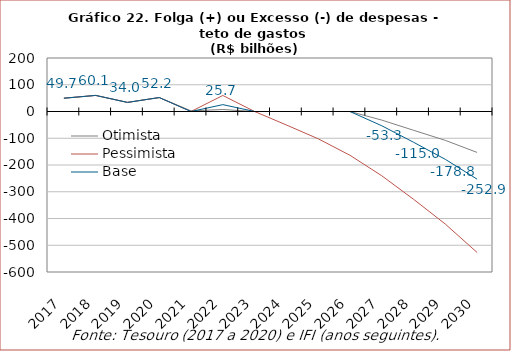
| Category | Otimista | Pessimista | Base |
|---|---|---|---|
| 2017.0 | 49.694 | 49.694 | 49.694 |
| 2018.0 | 60.12 | 60.12 | 60.12 |
| 2019.0 | 34.003 | 34.003 | 34.003 |
| 2020.0 | 52.155 | 52.155 | 52.155 |
| 2021.0 | 2.228 | 0 | 0 |
| 2022.0 | 7.449 | 59.947 | 25.664 |
| 2023.0 | 0 | 0 | 0 |
| 2024.0 | 0 | -50.352 | 0 |
| 2025.0 | 0 | -101.96 | 0 |
| 2026.0 | 0 | -163.629 | 0 |
| 2027.0 | -32.118 | -240.205 | -53.317 |
| 2028.0 | -70.171 | -328.115 | -114.995 |
| 2029.0 | -107.908 | -420.809 | -178.836 |
| 2030.0 | -152.983 | -527.077 | -252.894 |